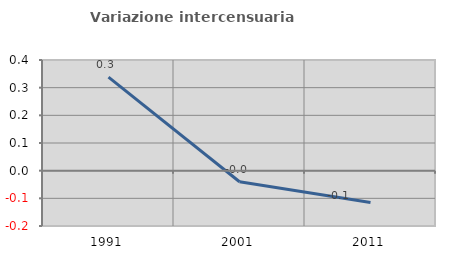
| Category | Variazione intercensuaria annua |
|---|---|
| 1991.0 | 0.338 |
| 2001.0 | -0.04 |
| 2011.0 | -0.115 |